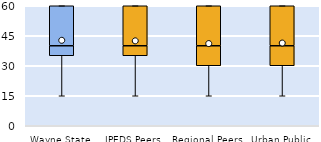
| Category | 25th | 50th | 75th |
|---|---|---|---|
| Wayne State | 35 | 5 | 20 |
| IPEDS Peers | 35 | 5 | 20 |
| Regional Peers | 30 | 10 | 20 |
| Urban Public | 30 | 10 | 20 |